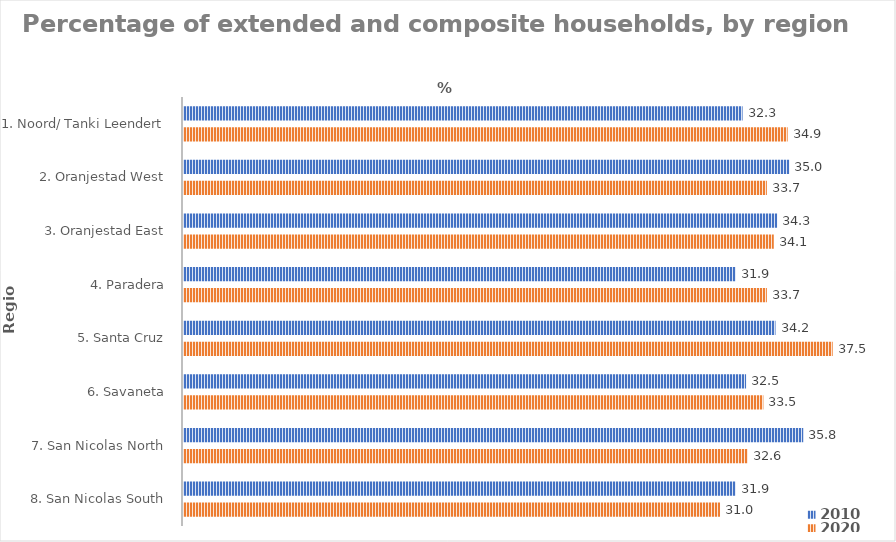
| Category | 2010 | 2020 |
|---|---|---|
| 1. Noord/ Tanki Leendert | 32.3 | 34.9 |
| 2. Oranjestad West | 35 | 33.7 |
| 3. Oranjestad East | 34.3 | 34.1 |
| 4. Paradera | 31.9 | 33.7 |
| 5. Santa Cruz | 34.2 | 37.5 |
| 6. Savaneta | 32.5 | 33.5 |
| 7. San Nicolas North | 35.8 | 32.6 |
| 8. San Nicolas South | 31.9 | 31 |